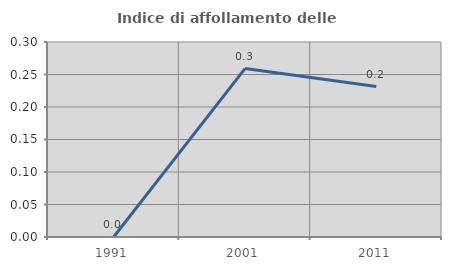
| Category | Indice di affollamento delle abitazioni  |
|---|---|
| 1991.0 | 0 |
| 2001.0 | 0.259 |
| 2011.0 | 0.231 |